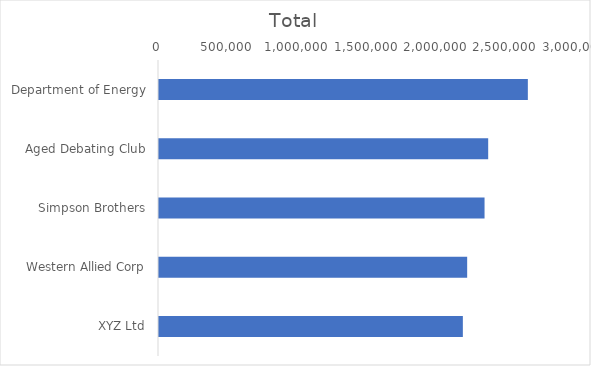
| Category | Total |
|---|---|
| Department of Energy | 2653587.3 |
| Aged Debating Club | 2368262.2 |
| Simpson Brothers | 2342085.25 |
| Western Allied Corp | 2217041.8 |
| XYZ Ltd | 2186000.85 |